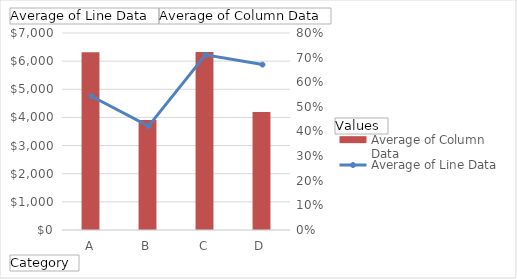
| Category | Average of Column Data |
|---|---|
| A | 6317.556 |
| B | 3909.143 |
| C | 6327.444 |
| D | 4191.167 |